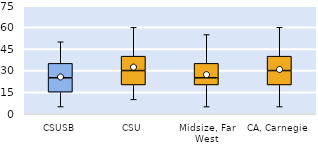
| Category | 25th | 50th | 75th |
|---|---|---|---|
| CSUSB | 15 | 10 | 10 |
| CSU | 20 | 10 | 10 |
| Midsize, Far West | 20 | 5 | 10 |
| CA, Carnegie | 20 | 10 | 10 |